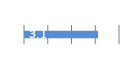
| Category | Series 0 |
|---|---|
| 0 | 3.115 |